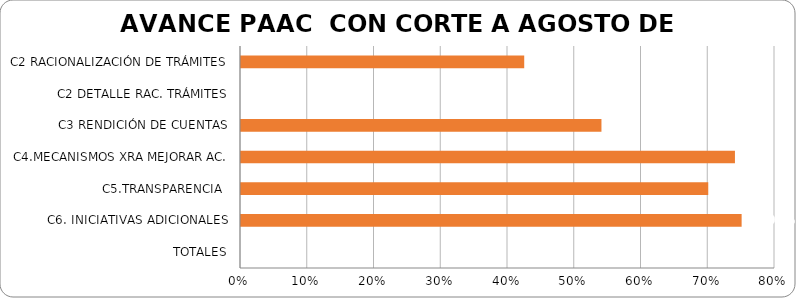
| Category | % AVANCE |
|---|---|
| C2 RACIONALIZACIÓN DE TRÁMITES | 0.424 |
| C2 DETALLE RAC. TRÁMITES | 0 |
| C3 RENDICIÓN DE CUENTAS | 0.54 |
| C4.MECANISMOS XRA MEJORAR AC. | 0.74 |
| C5.TRANSPARENCIA  | 0.7 |
| C6. INICIATIVAS ADICIONALES | 0.75 |
| TOTALES | 0 |